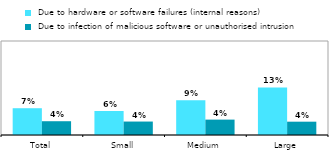
| Category |  Due to hardware or software failures (internal reasons) |  Due to infection of malicious software or unauthorised intrusion |
|---|---|---|
| Total | 0.071 | 0.037 |
| Small | 0.064 | 0.036 |
| Medium | 0.093 | 0.041 |
| Large | 0.126 | 0.035 |